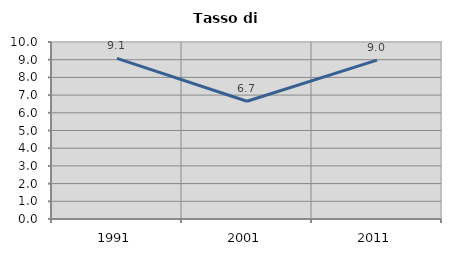
| Category | Tasso di disoccupazione   |
|---|---|
| 1991.0 | 9.073 |
| 2001.0 | 6.655 |
| 2011.0 | 8.972 |